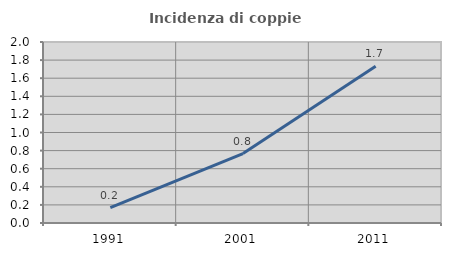
| Category | Incidenza di coppie miste |
|---|---|
| 1991.0 | 0.169 |
| 2001.0 | 0.768 |
| 2011.0 | 1.733 |